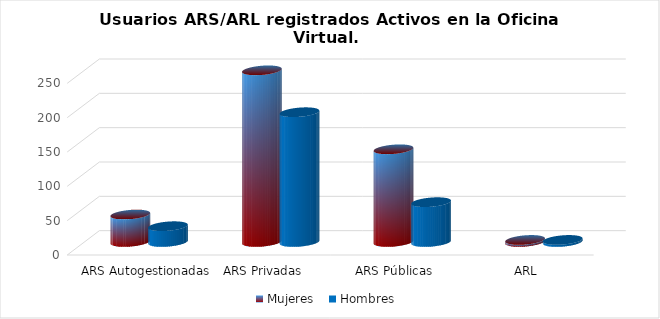
| Category | Mujeres | Hombres |
|---|---|---|
| ARS Autogestionadas | 40 | 23 |
| ARS Privadas | 250 | 189 |
| ARS Públicas | 135 | 58 |
| ARL | 3 | 3 |